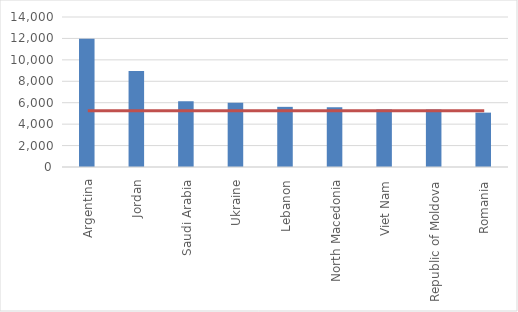
| Category | Series 0 |
|---|---|
| Argentina | 11975 |
| Jordan | 8963 |
| Saudi Arabia | 6136 |
| Ukraine | 5998 |
| Lebanon | 5614 |
| North Macedonia | 5569 |
| Viet Nam | 5377 |
| Republic of Moldova | 5367 |
| Romania | 5075 |